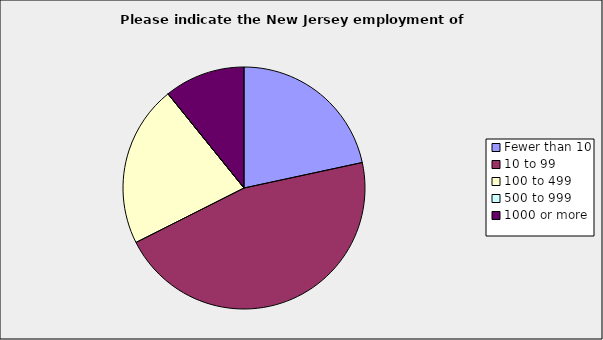
| Category | Series 0 |
|---|---|
| Fewer than 10 | 0.216 |
| 10 to 99 | 0.459 |
| 100 to 499 | 0.216 |
| 500 to 999 | 0 |
| 1000 or more | 0.108 |